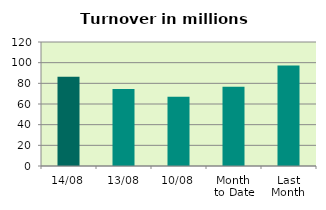
| Category | Series 0 |
|---|---|
| 14/08 | 86.282 |
| 13/08 | 74.524 |
| 10/08 | 66.905 |
| Month 
to Date | 76.667 |
| Last
Month | 97.283 |